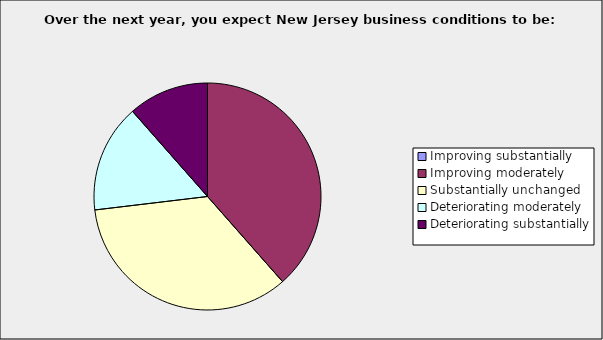
| Category | Series 0 |
|---|---|
| Improving substantially | 0 |
| Improving moderately | 0.385 |
| Substantially unchanged | 0.346 |
| Deteriorating moderately | 0.154 |
| Deteriorating substantially | 0.115 |